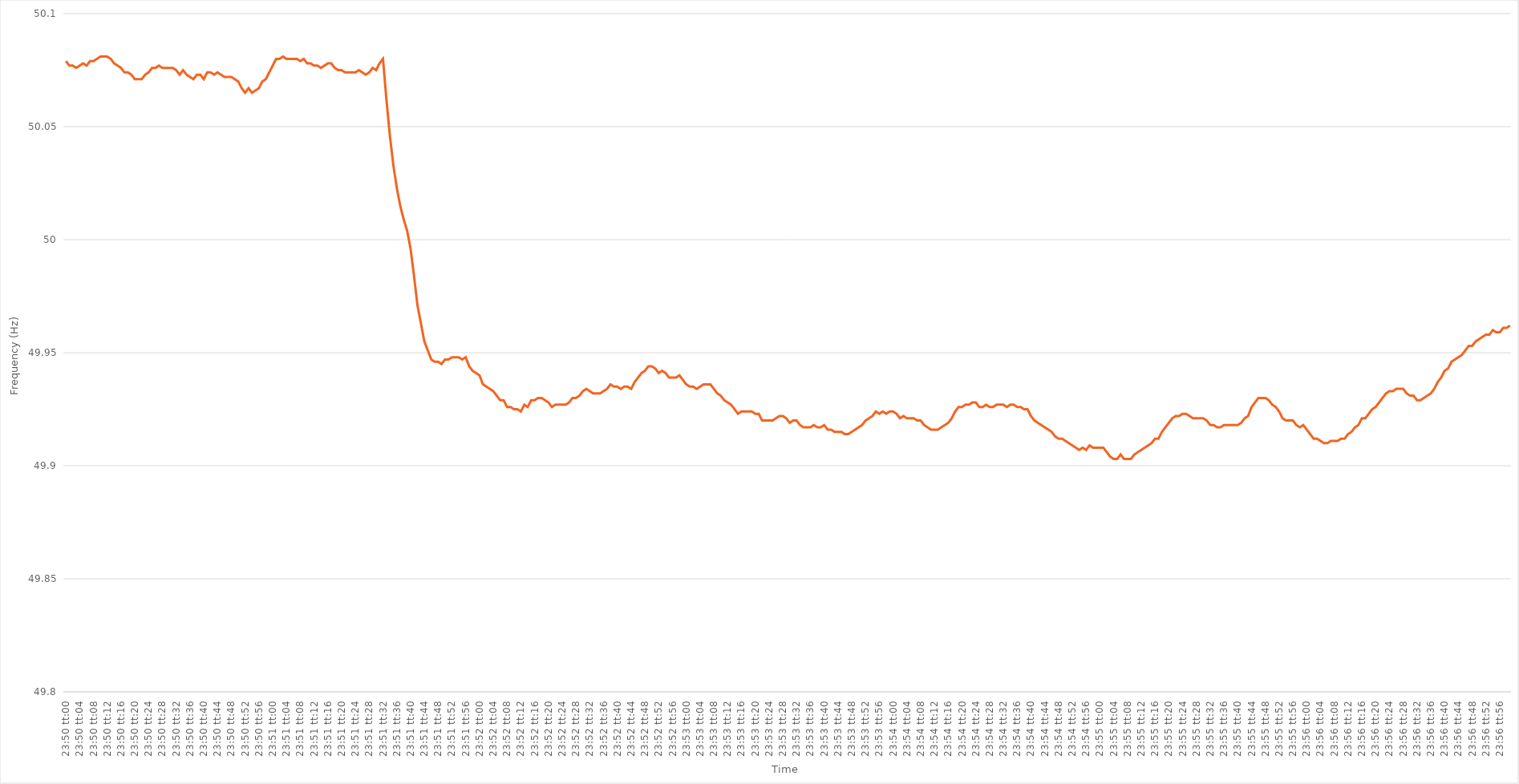
| Category | Series 0 |
|---|---|
| 0.9930555555555555 | 50.079 |
| 0.9930671296296296 | 50.077 |
| 0.9930787037037038 | 50.077 |
| 0.9930902777777778 | 50.076 |
| 0.9931018518518518 | 50.077 |
| 0.9931134259259259 | 50.078 |
| 0.993125 | 50.077 |
| 0.993136574074074 | 50.079 |
| 0.9931481481481481 | 50.079 |
| 0.9931597222222223 | 50.08 |
| 0.9931712962962963 | 50.081 |
| 0.9931828703703703 | 50.081 |
| 0.9931944444444444 | 50.081 |
| 0.9932060185185185 | 50.08 |
| 0.9932175925925927 | 50.078 |
| 0.9932291666666666 | 50.077 |
| 0.9932407407407408 | 50.076 |
| 0.9932523148148148 | 50.074 |
| 0.993263888888889 | 50.074 |
| 0.9932754629629629 | 50.073 |
| 0.993287037037037 | 50.071 |
| 0.9932986111111112 | 50.071 |
| 0.9933101851851852 | 50.071 |
| 0.9933217592592593 | 50.073 |
| 0.9933333333333333 | 50.074 |
| 0.9933449074074074 | 50.076 |
| 0.9933564814814814 | 50.076 |
| 0.9933680555555555 | 50.077 |
| 0.9933796296296297 | 50.076 |
| 0.9933912037037037 | 50.076 |
| 0.9934027777777777 | 50.076 |
| 0.9934143518518518 | 50.076 |
| 0.9934259259259259 | 50.075 |
| 0.9934375000000001 | 50.073 |
| 0.993449074074074 | 50.075 |
| 0.9934606481481482 | 50.073 |
| 0.9934722222222222 | 50.072 |
| 0.9934837962962964 | 50.071 |
| 0.9934953703703703 | 50.073 |
| 0.9935069444444444 | 50.073 |
| 0.9935185185185186 | 50.071 |
| 0.9935300925925926 | 50.074 |
| 0.9935416666666667 | 50.074 |
| 0.9935532407407407 | 50.073 |
| 0.9935648148148148 | 50.074 |
| 0.993576388888889 | 50.073 |
| 0.9935879629629629 | 50.072 |
| 0.9935995370370371 | 50.072 |
| 0.9936111111111111 | 50.072 |
| 0.9936226851851853 | 50.071 |
| 0.9936342592592592 | 50.07 |
| 0.9936458333333333 | 50.067 |
| 0.9936574074074075 | 50.065 |
| 0.9936689814814814 | 50.067 |
| 0.9936805555555556 | 50.065 |
| 0.9936921296296296 | 50.066 |
| 0.9937037037037038 | 50.067 |
| 0.9937152777777777 | 50.07 |
| 0.9937268518518518 | 50.071 |
| 0.993738425925926 | 50.074 |
| 0.99375 | 50.077 |
| 0.9937615740740741 | 50.08 |
| 0.9937731481481481 | 50.08 |
| 0.9937847222222222 | 50.081 |
| 0.9937962962962964 | 50.08 |
| 0.9938078703703703 | 50.08 |
| 0.9938194444444445 | 50.08 |
| 0.9938310185185185 | 50.08 |
| 0.9938425925925927 | 50.079 |
| 0.9938541666666666 | 50.08 |
| 0.9938657407407407 | 50.078 |
| 0.9938773148148149 | 50.078 |
| 0.9938888888888888 | 50.077 |
| 0.993900462962963 | 50.077 |
| 0.993912037037037 | 50.076 |
| 0.9939236111111112 | 50.077 |
| 0.9939351851851851 | 50.078 |
| 0.9939467592592592 | 50.078 |
| 0.9939583333333334 | 50.076 |
| 0.9939699074074074 | 50.075 |
| 0.9939814814814815 | 50.075 |
| 0.9939930555555555 | 50.074 |
| 0.9940046296296297 | 50.074 |
| 0.9940162037037038 | 50.074 |
| 0.9940277777777777 | 50.074 |
| 0.9940393518518519 | 50.075 |
| 0.9940509259259259 | 50.074 |
| 0.9940625000000001 | 50.073 |
| 0.994074074074074 | 50.074 |
| 0.9940856481481481 | 50.076 |
| 0.9940972222222223 | 50.075 |
| 0.9941087962962962 | 50.078 |
| 0.9941203703703704 | 50.08 |
| 0.9941319444444444 | 50.062 |
| 0.9941435185185186 | 50.046 |
| 0.9941550925925925 | 50.033 |
| 0.9941666666666666 | 50.023 |
| 0.9941782407407408 | 50.015 |
| 0.9941898148148148 | 50.009 |
| 0.9942013888888889 | 50.004 |
| 0.9942129629629629 | 49.996 |
| 0.9942245370370371 | 49.984 |
| 0.9942361111111112 | 49.971 |
| 0.9942476851851851 | 49.963 |
| 0.9942592592592593 | 49.955 |
| 0.9942708333333333 | 49.951 |
| 0.9942824074074075 | 49.947 |
| 0.9942939814814814 | 49.946 |
| 0.9943055555555556 | 49.946 |
| 0.9943171296296297 | 49.945 |
| 0.9943287037037036 | 49.947 |
| 0.9943402777777778 | 49.947 |
| 0.9943518518518518 | 49.948 |
| 0.994363425925926 | 49.948 |
| 0.9943749999999999 | 49.948 |
| 0.994386574074074 | 49.947 |
| 0.9943981481481482 | 49.948 |
| 0.9944097222222222 | 49.944 |
| 0.9944212962962963 | 49.942 |
| 0.9944328703703703 | 49.941 |
| 0.9944444444444445 | 49.94 |
| 0.9944560185185186 | 49.936 |
| 0.9944675925925925 | 49.935 |
| 0.9944791666666667 | 49.934 |
| 0.9944907407407407 | 49.933 |
| 0.9945023148148149 | 49.931 |
| 0.9945138888888888 | 49.929 |
| 0.994525462962963 | 49.929 |
| 0.9945370370370371 | 49.926 |
| 0.994548611111111 | 49.926 |
| 0.9945601851851852 | 49.925 |
| 0.9945717592592592 | 49.925 |
| 0.9945833333333334 | 49.924 |
| 0.9945949074074073 | 49.927 |
| 0.9946064814814815 | 49.926 |
| 0.9946180555555556 | 49.929 |
| 0.9946296296296296 | 49.929 |
| 0.9946412037037037 | 49.93 |
| 0.9946527777777777 | 49.93 |
| 0.9946643518518519 | 49.929 |
| 0.994675925925926 | 49.928 |
| 0.9946875 | 49.926 |
| 0.9946990740740741 | 49.927 |
| 0.9947106481481481 | 49.927 |
| 0.9947222222222223 | 49.927 |
| 0.9947337962962962 | 49.927 |
| 0.9947453703703704 | 49.928 |
| 0.9947569444444445 | 49.93 |
| 0.9947685185185186 | 49.93 |
| 0.9947800925925926 | 49.931 |
| 0.9947916666666666 | 49.933 |
| 0.9948032407407408 | 49.934 |
| 0.9948148148148147 | 49.933 |
| 0.9948263888888889 | 49.932 |
| 0.994837962962963 | 49.932 |
| 0.994849537037037 | 49.932 |
| 0.9948611111111111 | 49.933 |
| 0.9948726851851851 | 49.934 |
| 0.9948842592592593 | 49.936 |
| 0.9948958333333334 | 49.935 |
| 0.9949074074074074 | 49.935 |
| 0.9949189814814815 | 49.934 |
| 0.9949305555555555 | 49.935 |
| 0.9949421296296297 | 49.935 |
| 0.9949537037037036 | 49.934 |
| 0.9949652777777778 | 49.937 |
| 0.9949768518518519 | 49.939 |
| 0.994988425925926 | 49.941 |
| 0.995 | 49.942 |
| 0.995011574074074 | 49.944 |
| 0.9950231481481482 | 49.944 |
| 0.9950347222222223 | 49.943 |
| 0.9950462962962963 | 49.941 |
| 0.9950578703703704 | 49.942 |
| 0.9950694444444445 | 49.941 |
| 0.9950810185185185 | 49.939 |
| 0.9950925925925925 | 49.939 |
| 0.9951041666666667 | 49.939 |
| 0.9951157407407408 | 49.94 |
| 0.9951273148148148 | 49.938 |
| 0.9951388888888889 | 49.936 |
| 0.995150462962963 | 49.935 |
| 0.9951620370370371 | 49.935 |
| 0.995173611111111 | 49.934 |
| 0.9951851851851852 | 49.935 |
| 0.9951967592592593 | 49.936 |
| 0.9952083333333334 | 49.936 |
| 0.9952199074074074 | 49.936 |
| 0.9952314814814814 | 49.934 |
| 0.9952430555555556 | 49.932 |
| 0.9952546296296297 | 49.931 |
| 0.9952662037037037 | 49.929 |
| 0.9952777777777778 | 49.928 |
| 0.9952893518518519 | 49.927 |
| 0.9953009259259259 | 49.925 |
| 0.9953124999999999 | 49.923 |
| 0.9953240740740741 | 49.924 |
| 0.9953356481481482 | 49.924 |
| 0.9953472222222222 | 49.924 |
| 0.9953587962962963 | 49.924 |
| 0.9953703703703703 | 49.923 |
| 0.9953819444444445 | 49.923 |
| 0.9953935185185184 | 49.92 |
| 0.9954050925925926 | 49.92 |
| 0.9954166666666667 | 49.92 |
| 0.9954282407407408 | 49.92 |
| 0.9954398148148148 | 49.921 |
| 0.9954513888888888 | 49.922 |
| 0.995462962962963 | 49.922 |
| 0.9954745370370371 | 49.921 |
| 0.9954861111111111 | 49.919 |
| 0.9954976851851852 | 49.92 |
| 0.9955092592592593 | 49.92 |
| 0.9955208333333333 | 49.918 |
| 0.9955324074074073 | 49.917 |
| 0.9955439814814815 | 49.917 |
| 0.9955555555555556 | 49.917 |
| 0.9955671296296296 | 49.918 |
| 0.9955787037037037 | 49.917 |
| 0.9955902777777778 | 49.917 |
| 0.9956018518518519 | 49.918 |
| 0.9956134259259258 | 49.916 |
| 0.995625 | 49.916 |
| 0.9956365740740741 | 49.915 |
| 0.9956481481481482 | 49.915 |
| 0.9956597222222222 | 49.915 |
| 0.9956712962962962 | 49.914 |
| 0.9956828703703704 | 49.914 |
| 0.9956944444444445 | 49.915 |
| 0.9957060185185185 | 49.916 |
| 0.9957175925925926 | 49.917 |
| 0.9957291666666667 | 49.918 |
| 0.9957407407407407 | 49.92 |
| 0.9957523148148147 | 49.921 |
| 0.9957638888888889 | 49.922 |
| 0.995775462962963 | 49.924 |
| 0.995787037037037 | 49.923 |
| 0.9957986111111111 | 49.924 |
| 0.9958101851851852 | 49.923 |
| 0.9958217592592593 | 49.924 |
| 0.9958333333333332 | 49.924 |
| 0.9958449074074074 | 49.923 |
| 0.9958564814814815 | 49.921 |
| 0.9958680555555556 | 49.922 |
| 0.9958796296296296 | 49.921 |
| 0.9958912037037037 | 49.921 |
| 0.9959027777777778 | 49.921 |
| 0.995914351851852 | 49.92 |
| 0.9959259259259259 | 49.92 |
| 0.9959375 | 49.918 |
| 0.9959490740740741 | 49.917 |
| 0.9959606481481481 | 49.916 |
| 0.9959722222222221 | 49.916 |
| 0.9959837962962963 | 49.916 |
| 0.9959953703703704 | 49.917 |
| 0.9960069444444444 | 49.918 |
| 0.9960185185185185 | 49.919 |
| 0.9960300925925926 | 49.921 |
| 0.9960416666666667 | 49.924 |
| 0.9960532407407406 | 49.926 |
| 0.9960648148148148 | 49.926 |
| 0.9960763888888889 | 49.927 |
| 0.996087962962963 | 49.927 |
| 0.996099537037037 | 49.928 |
| 0.9961111111111111 | 49.928 |
| 0.9961226851851852 | 49.926 |
| 0.9961342592592594 | 49.926 |
| 0.9961458333333333 | 49.927 |
| 0.9961574074074074 | 49.926 |
| 0.9961689814814815 | 49.926 |
| 0.9961805555555556 | 49.927 |
| 0.9961921296296296 | 49.927 |
| 0.9962037037037037 | 49.927 |
| 0.9962152777777779 | 49.926 |
| 0.9962268518518519 | 49.927 |
| 0.9962384259259259 | 49.927 |
| 0.99625 | 49.926 |
| 0.9962615740740741 | 49.926 |
| 0.996273148148148 | 49.925 |
| 0.9962847222222222 | 49.925 |
| 0.9962962962962963 | 49.922 |
| 0.9963078703703704 | 49.92 |
| 0.9963194444444444 | 49.919 |
| 0.9963310185185185 | 49.918 |
| 0.9963425925925926 | 49.917 |
| 0.9963541666666668 | 49.916 |
| 0.9963657407407407 | 49.915 |
| 0.9963773148148148 | 49.913 |
| 0.9963888888888889 | 49.912 |
| 0.996400462962963 | 49.912 |
| 0.996412037037037 | 49.911 |
| 0.9964236111111111 | 49.91 |
| 0.9964351851851853 | 49.909 |
| 0.9964467592592593 | 49.908 |
| 0.9964583333333333 | 49.907 |
| 0.9964699074074074 | 49.908 |
| 0.9964814814814815 | 49.907 |
| 0.9964930555555555 | 49.909 |
| 0.9965046296296296 | 49.908 |
| 0.9965162037037038 | 49.908 |
| 0.9965277777777778 | 49.908 |
| 0.9965393518518518 | 49.908 |
| 0.9965509259259259 | 49.906 |
| 0.9965625 | 49.904 |
| 0.9965740740740742 | 49.903 |
| 0.9965856481481481 | 49.903 |
| 0.9965972222222222 | 49.905 |
| 0.9966087962962963 | 49.903 |
| 0.9966203703703704 | 49.903 |
| 0.9966319444444444 | 49.903 |
| 0.9966435185185185 | 49.905 |
| 0.9966550925925927 | 49.906 |
| 0.9966666666666667 | 49.907 |
| 0.9966782407407407 | 49.908 |
| 0.9966898148148148 | 49.909 |
| 0.9967013888888889 | 49.91 |
| 0.9967129629629629 | 49.912 |
| 0.996724537037037 | 49.912 |
| 0.9967361111111112 | 49.915 |
| 0.9967476851851852 | 49.917 |
| 0.9967592592592592 | 49.919 |
| 0.9967708333333333 | 49.921 |
| 0.9967824074074074 | 49.922 |
| 0.9967939814814816 | 49.922 |
| 0.9968055555555555 | 49.923 |
| 0.9968171296296297 | 49.923 |
| 0.9968287037037037 | 49.922 |
| 0.9968402777777778 | 49.921 |
| 0.9968518518518518 | 49.921 |
| 0.9968634259259259 | 49.921 |
| 0.9968750000000001 | 49.921 |
| 0.9968865740740741 | 49.92 |
| 0.9968981481481481 | 49.918 |
| 0.9969097222222222 | 49.918 |
| 0.9969212962962963 | 49.917 |
| 0.9969328703703703 | 49.917 |
| 0.9969444444444444 | 49.918 |
| 0.9969560185185186 | 49.918 |
| 0.9969675925925926 | 49.918 |
| 0.9969791666666666 | 49.918 |
| 0.9969907407407407 | 49.918 |
| 0.9970023148148148 | 49.919 |
| 0.997013888888889 | 49.921 |
| 0.9970254629629629 | 49.922 |
| 0.997037037037037 | 49.926 |
| 0.9970486111111111 | 49.928 |
| 0.9970601851851852 | 49.93 |
| 0.9970717592592592 | 49.93 |
| 0.9970833333333333 | 49.93 |
| 0.9970949074074075 | 49.929 |
| 0.9971064814814815 | 49.927 |
| 0.9971180555555555 | 49.926 |
| 0.9971296296296296 | 49.924 |
| 0.9971412037037037 | 49.921 |
| 0.9971527777777777 | 49.92 |
| 0.9971643518518518 | 49.92 |
| 0.997175925925926 | 49.92 |
| 0.9971875 | 49.918 |
| 0.997199074074074 | 49.917 |
| 0.9972106481481481 | 49.918 |
| 0.9972222222222222 | 49.916 |
| 0.9972337962962964 | 49.914 |
| 0.9972453703703703 | 49.912 |
| 0.9972569444444445 | 49.912 |
| 0.9972685185185185 | 49.911 |
| 0.9972800925925926 | 49.91 |
| 0.9972916666666666 | 49.91 |
| 0.9973032407407407 | 49.911 |
| 0.9973148148148149 | 49.911 |
| 0.9973263888888889 | 49.911 |
| 0.997337962962963 | 49.912 |
| 0.997349537037037 | 49.912 |
| 0.9973611111111111 | 49.914 |
| 0.9973726851851853 | 49.915 |
| 0.9973842592592592 | 49.917 |
| 0.9973958333333334 | 49.918 |
| 0.9974074074074074 | 49.921 |
| 0.9974189814814814 | 49.921 |
| 0.9974305555555555 | 49.923 |
| 0.9974421296296296 | 49.925 |
| 0.9974537037037038 | 49.926 |
| 0.9974652777777777 | 49.928 |
| 0.9974768518518519 | 49.93 |
| 0.9974884259259259 | 49.932 |
| 0.9975 | 49.933 |
| 0.997511574074074 | 49.933 |
| 0.9975231481481481 | 49.934 |
| 0.9975347222222223 | 49.934 |
| 0.9975462962962963 | 49.934 |
| 0.9975578703703704 | 49.932 |
| 0.9975694444444444 | 49.931 |
| 0.9975810185185185 | 49.931 |
| 0.9975925925925927 | 49.929 |
| 0.9976041666666666 | 49.929 |
| 0.9976157407407408 | 49.93 |
| 0.9976273148148148 | 49.931 |
| 0.997638888888889 | 49.932 |
| 0.9976504629629629 | 49.934 |
| 0.997662037037037 | 49.937 |
| 0.9976736111111112 | 49.939 |
| 0.9976851851851851 | 49.942 |
| 0.9976967592592593 | 49.943 |
| 0.9977083333333333 | 49.946 |
| 0.9977199074074075 | 49.947 |
| 0.9977314814814814 | 49.948 |
| 0.9977430555555555 | 49.949 |
| 0.9977546296296297 | 49.951 |
| 0.9977662037037037 | 49.953 |
| 0.9977777777777778 | 49.953 |
| 0.9977893518518518 | 49.955 |
| 0.997800925925926 | 49.956 |
| 0.9978125000000001 | 49.957 |
| 0.997824074074074 | 49.958 |
| 0.9978356481481482 | 49.958 |
| 0.9978472222222222 | 49.96 |
| 0.9978587962962964 | 49.959 |
| 0.9978703703703703 | 49.959 |
| 0.9978819444444444 | 49.961 |
| 0.9978935185185186 | 49.961 |
| 0.9979050925925925 | 49.962 |